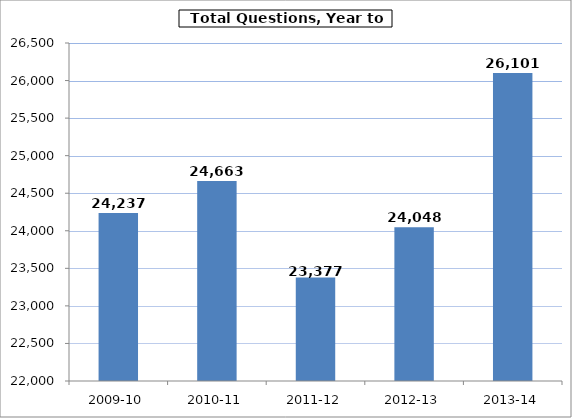
| Category | Series 0 |
|---|---|
| 2009-10 | 24237 |
| 2010-11 | 24663 |
| 2011-12 | 23377 |
| 2012-13 | 24048 |
| 2013-14 | 26101 |